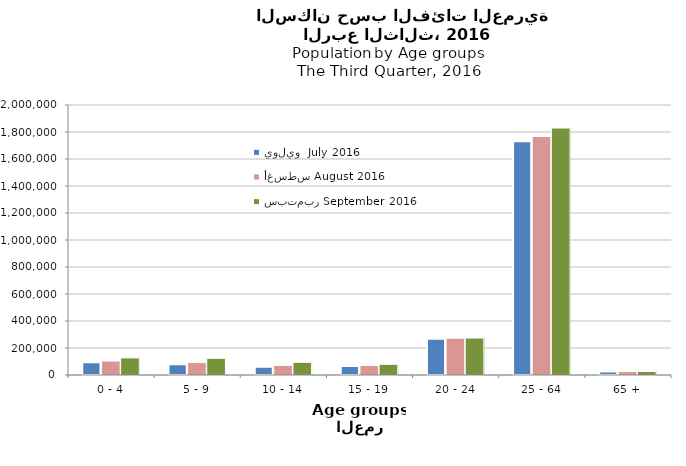
| Category | يوليو  July 2016 | أغسطس August 2016 | سبتمبر September 2016  |
|---|---|---|---|
| 0 - 4 | 94161 | 103425 | 126683 |
| 5 - 9 | 79884 | 92188 | 123779 |
| 10 - 14 | 61795 | 71176 | 94084 |
| 15 - 19 | 65830 | 70070 | 79454 |
| 20 - 24 | 268917 | 272729 | 273798 |
| 25 - 64 | 1730679 | 1766855 | 1829547 |
| 65 + | 25199 | 25155 | 26048 |